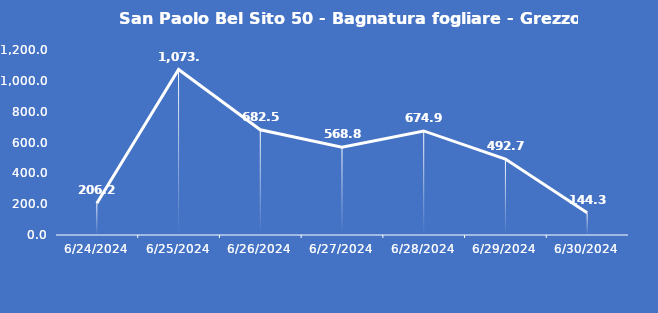
| Category | San Paolo Bel Sito 50 - Bagnatura fogliare - Grezzo (min) |
|---|---|
| 6/24/24 | 206.2 |
| 6/25/24 | 1073.4 |
| 6/26/24 | 682.5 |
| 6/27/24 | 568.8 |
| 6/28/24 | 674.9 |
| 6/29/24 | 492.7 |
| 6/30/24 | 144.3 |